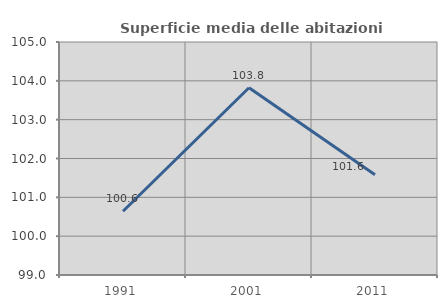
| Category | Superficie media delle abitazioni occupate |
|---|---|
| 1991.0 | 100.642 |
| 2001.0 | 103.822 |
| 2011.0 | 101.584 |